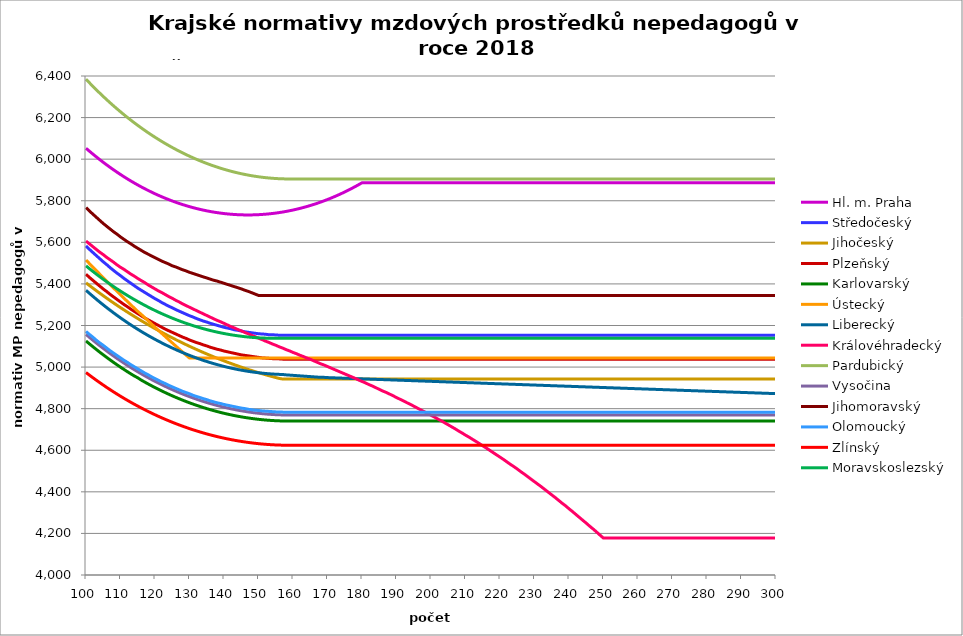
| Category | Hl. m. Praha | Středočeský | Jihočeský | Plzeňský | Karlovarský  | Ústecký   | Liberecký | Královéhradecký | Pardubický | Vysočina | Jihomoravský | Olomoucký | Zlínský | Moravskoslezský |
|---|---|---|---|---|---|---|---|---|---|---|---|---|---|---|
| 100.0 | 6052.468 | 5582.738 | 5404.99 | 5446.608 | 5125.55 | 5514.952 | 5369.339 | 5605.989 | 6384.639 | 5156.925 | 5767.363 | 5171.561 | 4973.825 | 5486.8 |
| 101.0 | 6038.229 | 5566.172 | 5392.238 | 5431.139 | 5111.603 | 5497.761 | 5354.653 | 5592.531 | 6367.266 | 5142.946 | 5750.633 | 5156.948 | 4961.222 | 5473.272 |
| 102.0 | 6024.36 | 5551.073 | 5379.684 | 5417.152 | 5097.969 | 5480.678 | 5340.296 | 5579.138 | 6350.282 | 5129.174 | 5735.508 | 5143.736 | 4948.896 | 5460.059 |
| 103.0 | 6010.859 | 5536.055 | 5367.325 | 5403.237 | 5084.641 | 5463.7 | 5326.264 | 5565.808 | 6333.681 | 5115.739 | 5720.462 | 5129.28 | 4936.843 | 5447.159 |
| 104.0 | 5997.719 | 5521.118 | 5355.159 | 5389.393 | 5071.617 | 5446.828 | 5312.551 | 5552.542 | 6317.458 | 5102.636 | 5705.495 | 5116.208 | 4925.061 | 5434.567 |
| 105.0 | 5984.937 | 5506.262 | 5343.183 | 5375.62 | 5058.893 | 5430.059 | 5299.153 | 5540.803 | 6301.607 | 5089.859 | 5690.605 | 5104.5 | 4913.546 | 5422.278 |
| 106.0 | 5972.509 | 5492.826 | 5331.395 | 5363.284 | 5046.463 | 5413.393 | 5286.066 | 5527.656 | 6286.124 | 5077.405 | 5677.272 | 5091.555 | 4902.293 | 5410.291 |
| 107.0 | 5960.43 | 5478.121 | 5319.793 | 5349.644 | 5034.325 | 5396.829 | 5273.287 | 5516.022 | 6271.004 | 5065.141 | 5664 | 5078.674 | 4891.301 | 5398.6 |
| 108.0 | 5948.697 | 5464.822 | 5308.376 | 5337.427 | 5022.474 | 5380.366 | 5260.81 | 5504.437 | 6256.242 | 5053.192 | 5650.79 | 5067.138 | 4880.566 | 5387.203 |
| 109.0 | 5937.306 | 5451.586 | 5297.14 | 5325.266 | 5010.908 | 5364.003 | 5248.633 | 5491.461 | 6241.834 | 5041.555 | 5639.1 | 5055.653 | 4870.085 | 5376.095 |
| 110.0 | 5926.253 | 5439.729 | 5286.085 | 5313.16 | 4999.621 | 5347.74 | 5236.751 | 5479.979 | 6227.776 | 5030.225 | 5626.006 | 5044.221 | 4859.854 | 5365.274 |
| 111.0 | 5915.535 | 5426.615 | 5275.208 | 5301.109 | 4988.612 | 5331.575 | 5225.161 | 5469.971 | 6214.062 | 5019.199 | 5614.418 | 5032.84 | 4849.872 | 5354.737 |
| 112.0 | 5905.148 | 5414.866 | 5264.507 | 5290.443 | 4977.876 | 5315.507 | 5213.86 | 5458.578 | 6200.689 | 5008.347 | 5602.878 | 5022.767 | 4840.135 | 5344.48 |
| 113.0 | 5895.089 | 5403.169 | 5253.98 | 5278.494 | 4967.411 | 5299.536 | 5202.843 | 5447.233 | 6187.653 | 4997.792 | 5592.819 | 5011.483 | 4830.641 | 5334.501 |
| 114.0 | 5885.354 | 5391.521 | 5243.625 | 5267.919 | 4957.213 | 5283.66 | 5192.108 | 5437.344 | 6174.949 | 4987.532 | 5581.367 | 5001.495 | 4821.386 | 5324.796 |
| 115.0 | 5875.941 | 5379.924 | 5233.442 | 5257.386 | 4948.515 | 5267.879 | 5181.651 | 5426.087 | 6162.575 | 4977.562 | 5571.385 | 4991.546 | 4812.369 | 5315.363 |
| 116.0 | 5866.847 | 5369.656 | 5223.427 | 5246.894 | 4937.607 | 5253.615 | 5171.47 | 5416.275 | 6150.527 | 4967.88 | 5561.438 | 4981.638 | 4803.587 | 5306.199 |
| 117.0 | 5858.07 | 5359.429 | 5213.579 | 5236.445 | 4928.193 | 5238.013 | 5161.561 | 5406.498 | 6138.801 | 4958.359 | 5551.527 | 4971.768 | 4795.037 | 5297.302 |
| 118.0 | 5849.605 | 5349.24 | 5203.897 | 5227.336 | 4919.035 | 5222.503 | 5151.921 | 5395.368 | 6127.393 | 4949.121 | 5543.06 | 4963.164 | 4786.717 | 5288.668 |
| 119.0 | 5841.451 | 5339.089 | 5194.379 | 5218.258 | 4910.13 | 5207.085 | 5142.548 | 5385.667 | 6116.301 | 4940.161 | 5534.619 | 4953.368 | 4778.626 | 5280.296 |
| 120.0 | 5833.605 | 5328.977 | 5185.024 | 5209.212 | 4901.475 | 5191.758 | 5133.439 | 5376 | 6105.52 | 4931.478 | 5526.204 | 4944.828 | 4770.76 | 5272.183 |
| 121.0 | 5826.065 | 5320.161 | 5175.829 | 5200.198 | 4893.069 | 5176.521 | 5124.591 | 5366.368 | 6095.049 | 4923.069 | 5517.814 | 4936.317 | 4763.118 | 5264.327 |
| 122.0 | 5818.829 | 5310.12 | 5166.793 | 5191.214 | 4884.909 | 5161.373 | 5116.002 | 5358.14 | 6084.884 | 4914.81 | 5509.449 | 4927.835 | 4755.698 | 5256.726 |
| 123.0 | 5811.894 | 5301.366 | 5157.915 | 5182.262 | 4876.991 | 5146.313 | 5107.669 | 5348.571 | 6075.022 | 4906.82 | 5502.498 | 4920.588 | 4748.497 | 5249.377 |
| 124.0 | 5805.258 | 5292.64 | 5149.193 | 5174.613 | 4869.315 | 5131.341 | 5099.591 | 5339.037 | 6065.46 | 4899.097 | 5495.565 | 4912.161 | 4741.515 | 5242.279 |
| 125.0 | 5798.919 | 5285.184 | 5140.626 | 5166.986 | 4861.878 | 5116.456 | 5091.763 | 5330.892 | 6056.196 | 4891.639 | 5487.267 | 4904.96 | 4734.748 | 5235.429 |
| 126.0 | 5792.876 | 5276.512 | 5132.212 | 5159.382 | 4854.678 | 5101.657 | 5084.186 | 5321.421 | 6047.228 | 4884.443 | 5481.75 | 4897.78 | 4728.196 | 5228.827 |
| 127.0 | 5787.126 | 5269.101 | 5123.951 | 5151.8 | 4847.713 | 5086.943 | 5076.855 | 5313.33 | 6038.551 | 4877.387 | 5474.868 | 4890.621 | 4721.856 | 5222.469 |
| 128.0 | 5781.668 | 5261.711 | 5115.84 | 5144.241 | 4840.981 | 5072.314 | 5069.77 | 5303.921 | 6030.166 | 4870.59 | 5468.004 | 4883.483 | 4715.727 | 5216.354 |
| 129.0 | 5776.5 | 5254.342 | 5107.878 | 5137.958 | 4834.48 | 5057.769 | 5062.929 | 5295.883 | 6022.068 | 4864.049 | 5462.525 | 4877.551 | 4709.808 | 5210.481 |
| 130.0 | 5771.621 | 5246.993 | 5100.065 | 5130.439 | 4828.208 | 5043.306 | 5056.329 | 5287.869 | 6014.255 | 4857.763 | 5455.692 | 4871.633 | 4704.096 | 5204.848 |
| 131.0 | 5767.029 | 5240.885 | 5092.399 | 5124.19 | 4822.164 | 5043.306 | 5049.968 | 5279.879 | 6006.727 | 4851.729 | 5450.237 | 4864.551 | 4698.591 | 5199.454 |
| 132.0 | 5762.723 | 5233.574 | 5084.878 | 5117.956 | 4816.346 | 5043.306 | 5043.845 | 5271.914 | 5999.479 | 4845.828 | 5444.794 | 4858.664 | 4693.291 | 5194.296 |
| 133.0 | 5758.701 | 5227.497 | 5077.502 | 5112.98 | 4810.753 | 5043.306 | 5037.959 | 5263.972 | 5992.512 | 4840.177 | 5439.361 | 4853.965 | 4688.194 | 5189.374 |
| 134.0 | 5754.963 | 5221.434 | 5070.269 | 5106.773 | 4805.382 | 5043.306 | 5032.307 | 5256.054 | 5985.822 | 4834.773 | 5433.94 | 4848.104 | 4683.3 | 5184.687 |
| 135.0 | 5751.508 | 5216.593 | 5063.179 | 5101.819 | 4800.233 | 5043.306 | 5026.888 | 5248.16 | 5979.407 | 4829.616 | 5428.529 | 4843.426 | 4678.607 | 5180.233 |
| 136.0 | 5748.334 | 5210.556 | 5056.229 | 5095.64 | 4795.304 | 5043.306 | 5021.701 | 5240.29 | 5973.267 | 4824.703 | 5423.129 | 4837.59 | 4674.114 | 5176.01 |
| 137.0 | 5745.44 | 5205.735 | 5049.42 | 5090.707 | 4790.593 | 5043.306 | 5016.744 | 5232.443 | 5967.4 | 4819.917 | 5417.739 | 4832.932 | 4669.82 | 5172.019 |
| 138.0 | 5742.825 | 5200.924 | 5042.749 | 5085.783 | 4786.1 | 5043.306 | 5012.016 | 5224.62 | 5961.803 | 4815.373 | 5413.704 | 4828.283 | 4665.723 | 5168.257 |
| 139.0 | 5740.49 | 5196.122 | 5036.217 | 5082.097 | 4781.823 | 5043.306 | 5007.516 | 5218.118 | 5956.476 | 4811.071 | 5408.333 | 4824.802 | 4661.823 | 5164.724 |
| 140.0 | 5738.433 | 5191.328 | 5029.821 | 5077.19 | 4777.762 | 5043.306 | 5003.242 | 5210.338 | 5951.416 | 4807.007 | 5402.973 | 4820.168 | 4658.119 | 5161.418 |
| 141.0 | 5736.653 | 5187.739 | 5023.561 | 5073.517 | 4773.914 | 5043.306 | 4999.194 | 5202.581 | 5946.624 | 4803.183 | 5397.624 | 4816.699 | 4654.61 | 5158.34 |
| 142.0 | 5735.15 | 5184.155 | 5017.437 | 5069.848 | 4770.28 | 5043.306 | 4995.369 | 5194.846 | 5942.096 | 4799.48 | 5392.285 | 4813.234 | 4651.295 | 5155.488 |
| 143.0 | 5733.924 | 5179.383 | 5011.446 | 5066.185 | 4766.857 | 5043.306 | 4991.768 | 5188.419 | 5937.833 | 4796.013 | 5386.957 | 4809.775 | 4648.173 | 5152.862 |
| 144.0 | 5732.974 | 5177.001 | 5005.589 | 5062.527 | 4763.646 | 5043.306 | 4988.389 | 5180.726 | 5933.833 | 4792.782 | 5381.639 | 4806.32 | 4645.243 | 5150.46 |
| 145.0 | 5732.3 | 5173.431 | 4999.864 | 5058.874 | 4760.645 | 5043.306 | 4985.231 | 5174.334 | 5930.095 | 4789.786 | 5376.331 | 4802.871 | 4642.505 | 5148.282 |
| 146.0 | 5731.902 | 5169.867 | 4994.27 | 5056.442 | 4757.854 | 5043.306 | 4982.294 | 5166.683 | 5926.618 | 4787.024 | 5369.712 | 4800.574 | 4639.958 | 5146.328 |
| 147.0 | 5731.78 | 5167.493 | 4988.807 | 5054.012 | 4755.272 | 5043.306 | 4979.577 | 5160.325 | 5923.402 | 4784.38 | 5364.428 | 4797.133 | 4637.602 | 5144.596 |
| 148.0 | 5731.933 | 5165.122 | 4983.473 | 5051.585 | 4752.897 | 5043.306 | 4977.079 | 5152.716 | 5920.444 | 4781.968 | 5357.838 | 4794.841 | 4635.435 | 5143.088 |
| 149.0 | 5732.362 | 5162.752 | 4978.269 | 5049.16 | 4750.731 | 5043.306 | 4974.799 | 5146.392 | 5917.745 | 4779.788 | 5351.264 | 4792.552 | 4633.457 | 5141.802 |
| 150.0 | 5733.066 | 5160.385 | 4973.193 | 5046.737 | 4748.771 | 5043.306 | 4972.737 | 5138.824 | 5915.304 | 4777.839 | 5344.706 | 4791.408 | 4631.669 | 5140.737 |
| 151.0 | 5734.047 | 5159.202 | 4968.244 | 5044.317 | 4747.018 | 5043.306 | 4970.892 | 5132.534 | 5913.12 | 4776.121 | 5344.706 | 4789.122 | 4630.068 | 5139.894 |
| 152.0 | 5735.304 | 5158.02 | 4963.422 | 5043.107 | 4745.47 | 5043.306 | 4969.264 | 5125.006 | 5911.193 | 4774.518 | 5344.706 | 4787.98 | 4628.656 | 5139.273 |
| 153.0 | 5736.837 | 5155.657 | 4958.726 | 5041.898 | 4744.129 | 5043.306 | 4967.852 | 5118.75 | 5909.521 | 4773.145 | 5344.706 | 4786.838 | 4627.431 | 5138.872 |
| 154.0 | 5738.648 | 5155.657 | 4954.155 | 5040.69 | 4742.992 | 5043.306 | 4966.656 | 5111.263 | 5908.106 | 4772.002 | 5344.706 | 4785.697 | 4626.394 | 5138.693 |
| 155.0 | 5740.736 | 5154.477 | 4949.709 | 5039.483 | 4742.061 | 5043.306 | 4965.676 | 5105.04 | 5906.945 | 4771.088 | 5344.706 | 4784.557 | 4625.544 | 5138.195 |
| 156.0 | 5743.102 | 5153.297 | 4945.387 | 5039.483 | 4741.334 | 5043.306 | 4964.912 | 5097.593 | 5906.04 | 4770.402 | 5344.706 | 4783.417 | 4624.88 | 5138.195 |
| 157.0 | 5745.747 | 5153.297 | 4942.671 | 5038.275 | 4740.812 | 5043.306 | 4964.362 | 5091.404 | 5905.39 | 4769.831 | 5344.706 | 4783.417 | 4624.403 | 5138.195 |
| 158.0 | 5748.672 | 5153.297 | 4942.671 | 5038.275 | 4740.494 | 5043.306 | 4962.571 | 5083.996 | 5904.994 | 4769.489 | 5344.706 | 4782.277 | 4624.113 | 5138.195 |
| 159.0 | 5751.878 | 5153.297 | 4942.671 | 5038.275 | 4740.38 | 5043.306 | 4961.378 | 5077.84 | 5904.852 | 4769.374 | 5344.706 | 4782.277 | 4624.01 | 5138.195 |
| 160.0 | 5755.365 | 5153.297 | 4942.671 | 5038.275 | 4740.471 | 5043.306 | 4960.185 | 5070.472 | 5904.683 | 4769.26 | 5344.706 | 4782.277 | 4624.01 | 5138.195 |
| 161.0 | 5759.134 | 5153.297 | 4942.671 | 5038.275 | 4740.244 | 5043.306 | 4958.993 | 5064.348 | 5904.683 | 4769.26 | 5344.706 | 4782.277 | 4624.01 | 5138.195 |
| 162.0 | 5763.187 | 5153.297 | 4942.671 | 5038.275 | 4740.244 | 5043.306 | 4957.802 | 5057.019 | 5904.683 | 4769.26 | 5344.706 | 4782.277 | 4624.01 | 5138.195 |
| 163.0 | 5767.525 | 5153.297 | 4942.671 | 5038.275 | 4740.244 | 5043.306 | 4956.611 | 5050.927 | 5904.683 | 4769.26 | 5344.706 | 4782.277 | 4624.01 | 5138.195 |
| 164.0 | 5772.149 | 5153.297 | 4942.671 | 5038.275 | 4740.244 | 5043.306 | 4955.421 | 5043.637 | 5904.683 | 4769.26 | 5344.706 | 4782.277 | 4624.01 | 5138.195 |
| 165.0 | 5777.06 | 5153.297 | 4942.671 | 5038.275 | 4740.244 | 5043.306 | 4954.231 | 5037.578 | 5904.683 | 4769.26 | 5344.706 | 4782.277 | 4624.01 | 5138.195 |
| 166.0 | 5782.26 | 5153.297 | 4942.671 | 5038.275 | 4740.244 | 5043.306 | 4953.042 | 5030.326 | 5904.683 | 4769.26 | 5344.706 | 4782.277 | 4624.01 | 5138.195 |
| 167.0 | 5787.75 | 5153.297 | 4942.671 | 5038.275 | 4740.244 | 5043.306 | 4951.853 | 5023.095 | 5904.683 | 4769.26 | 5344.706 | 4782.277 | 4624.01 | 5138.195 |
| 168.0 | 5793.532 | 5153.297 | 4942.671 | 5038.275 | 4740.244 | 5043.306 | 4950.665 | 5015.885 | 5904.683 | 4769.26 | 5344.706 | 4782.277 | 4624.01 | 5138.195 |
| 169.0 | 5799.609 | 5153.297 | 4942.671 | 5038.275 | 4740.244 | 5043.306 | 4950.665 | 5009.892 | 5904.683 | 4769.26 | 5344.706 | 4782.277 | 4624.01 | 5138.195 |
| 170.0 | 5805.98 | 5153.297 | 4942.671 | 5038.275 | 4740.244 | 5043.306 | 4949.477 | 5002.72 | 5904.683 | 4769.26 | 5344.706 | 4782.277 | 4624.01 | 5138.195 |
| 171.0 | 5812.649 | 5153.297 | 4942.671 | 5038.275 | 4740.244 | 5043.306 | 4948.833 | 4995.568 | 5904.683 | 4769.26 | 5344.706 | 4782.277 | 4624.01 | 5138.195 |
| 172.0 | 5819.618 | 5153.297 | 4942.671 | 5038.275 | 4740.244 | 5043.306 | 4948.23 | 4988.437 | 5904.683 | 4769.26 | 5344.706 | 4782.277 | 4624.01 | 5138.195 |
| 173.0 | 5826.888 | 5153.297 | 4942.671 | 5038.275 | 4740.244 | 5043.306 | 4947.628 | 4981.326 | 5904.683 | 4769.26 | 5344.706 | 4782.277 | 4624.01 | 5138.195 |
| 174.0 | 5834.462 | 5153.297 | 4942.671 | 5038.275 | 4740.244 | 5043.306 | 4947.026 | 4974.235 | 5904.683 | 4769.26 | 5344.706 | 4782.277 | 4624.01 | 5138.195 |
| 175.0 | 5842.342 | 5153.297 | 4942.671 | 5038.275 | 4740.244 | 5043.306 | 4946.424 | 4967.164 | 5904.683 | 4769.26 | 5344.706 | 4782.277 | 4624.01 | 5138.195 |
| 176.0 | 5850.53 | 5153.297 | 4942.671 | 5038.275 | 4740.244 | 5043.306 | 4945.822 | 4960.114 | 5904.683 | 4769.26 | 5344.706 | 4782.277 | 4624.01 | 5138.195 |
| 177.0 | 5859.029 | 5153.297 | 4942.671 | 5038.275 | 4740.244 | 5043.306 | 4945.22 | 4953.083 | 5904.683 | 4769.26 | 5344.706 | 4782.277 | 4624.01 | 5138.195 |
| 178.0 | 5867.842 | 5153.297 | 4942.671 | 5038.275 | 4740.244 | 5043.306 | 4944.619 | 4946.072 | 5904.683 | 4769.26 | 5344.706 | 4782.277 | 4624.01 | 5138.195 |
| 179.0 | 5876.971 | 5153.297 | 4942.671 | 5038.275 | 4740.244 | 5043.306 | 4944.017 | 4937.918 | 5904.683 | 4769.26 | 5344.706 | 4782.277 | 4624.01 | 5138.195 |
| 180.0 | 5886.42 | 5153.297 | 4942.671 | 5038.275 | 4740.244 | 5043.306 | 4943.416 | 4930.95 | 5904.683 | 4769.26 | 5344.706 | 4782.277 | 4624.01 | 5138.195 |
| 181.0 | 5886.42 | 5153.297 | 4942.671 | 5038.275 | 4740.244 | 5043.306 | 4942.815 | 4924.002 | 5904.683 | 4769.26 | 5344.706 | 4782.277 | 4624.01 | 5138.195 |
| 182.0 | 5886.42 | 5153.297 | 4942.671 | 5038.275 | 4740.244 | 5043.306 | 4942.214 | 4915.92 | 5904.683 | 4769.26 | 5344.706 | 4782.277 | 4624.01 | 5138.195 |
| 183.0 | 5886.42 | 5153.297 | 4942.671 | 5038.275 | 4740.244 | 5043.306 | 4941.613 | 4909.014 | 5904.683 | 4769.26 | 5344.706 | 4782.277 | 4624.01 | 5138.195 |
| 184.0 | 5886.42 | 5153.297 | 4942.671 | 5038.275 | 4740.244 | 5043.306 | 4941.013 | 4900.982 | 5904.683 | 4769.26 | 5344.706 | 4782.277 | 4624.01 | 5138.195 |
| 185.0 | 5886.42 | 5153.297 | 4942.671 | 5038.275 | 4740.244 | 5043.306 | 4940.412 | 4892.975 | 5904.683 | 4769.26 | 5344.706 | 4782.277 | 4624.01 | 5138.195 |
| 186.0 | 5886.42 | 5153.297 | 4942.671 | 5038.275 | 4740.244 | 5043.306 | 4939.812 | 4884.995 | 5904.683 | 4769.26 | 5344.706 | 4782.277 | 4624.01 | 5138.195 |
| 187.0 | 5886.42 | 5153.297 | 4942.671 | 5038.275 | 4740.244 | 5043.306 | 4939.212 | 4878.176 | 5904.683 | 4769.26 | 5344.706 | 4782.277 | 4624.01 | 5138.195 |
| 188.0 | 5886.42 | 5153.297 | 4942.671 | 5038.275 | 4740.244 | 5043.306 | 4938.612 | 4870.244 | 5904.683 | 4769.26 | 5344.706 | 4782.277 | 4624.01 | 5138.195 |
| 189.0 | 5886.42 | 5153.297 | 4942.671 | 5038.275 | 4740.244 | 5043.306 | 4938.012 | 4862.338 | 5904.683 | 4769.26 | 5344.706 | 4782.277 | 4624.01 | 5138.195 |
| 190.0 | 5886.42 | 5153.297 | 4942.671 | 5038.275 | 4740.244 | 5043.306 | 4937.412 | 4853.333 | 5904.683 | 4769.26 | 5344.706 | 4782.277 | 4624.01 | 5138.195 |
| 191.0 | 5886.42 | 5153.297 | 4942.671 | 5038.275 | 4740.244 | 5043.306 | 4936.812 | 4845.482 | 5904.683 | 4769.26 | 5344.706 | 4782.277 | 4624.01 | 5138.195 |
| 192.0 | 5886.42 | 5153.297 | 4942.671 | 5038.275 | 4740.244 | 5043.306 | 4936.213 | 4837.656 | 5904.683 | 4769.26 | 5344.706 | 4782.277 | 4624.01 | 5138.195 |
| 193.0 | 5886.42 | 5153.297 | 4942.671 | 5038.275 | 4740.244 | 5043.306 | 4935.613 | 4828.743 | 5904.683 | 4769.26 | 5344.706 | 4782.277 | 4624.01 | 5138.195 |
| 194.0 | 5886.42 | 5153.297 | 4942.671 | 5038.275 | 4740.244 | 5043.306 | 4935.014 | 4820.97 | 5904.683 | 4769.26 | 5344.706 | 4782.277 | 4624.01 | 5138.195 |
| 195.0 | 5886.42 | 5153.297 | 4942.671 | 5038.275 | 4740.244 | 5043.306 | 4934.415 | 4812.118 | 5904.683 | 4769.26 | 5344.706 | 4782.277 | 4624.01 | 5138.195 |
| 196.0 | 5886.42 | 5153.297 | 4942.671 | 5038.275 | 4740.244 | 5043.306 | 4933.816 | 4803.299 | 5904.683 | 4769.26 | 5344.706 | 4782.277 | 4624.01 | 5138.195 |
| 197.0 | 5886.42 | 5153.297 | 4942.671 | 5038.275 | 4740.244 | 5043.306 | 4933.217 | 4794.512 | 5904.683 | 4769.26 | 5344.706 | 4782.277 | 4624.01 | 5138.195 |
| 198.0 | 5886.42 | 5153.297 | 4942.671 | 5038.275 | 4740.244 | 5043.306 | 4932.619 | 4785.757 | 5904.683 | 4769.26 | 5344.706 | 4782.277 | 4624.01 | 5138.195 |
| 199.0 | 5886.42 | 5153.297 | 4942.671 | 5038.275 | 4740.244 | 5043.306 | 4932.02 | 4777.033 | 5904.683 | 4769.26 | 5344.706 | 4782.277 | 4624.01 | 5138.195 |
| 200.0 | 5886.42 | 5153.297 | 4942.671 | 5038.275 | 4740.244 | 5043.306 | 4931.422 | 4768.342 | 5904.683 | 4769.26 | 5344.706 | 4782.277 | 4624.01 | 5138.195 |
| 201.0 | 5886.42 | 5153.297 | 4942.671 | 5038.275 | 4740.244 | 5043.306 | 4930.824 | 4759.682 | 5904.683 | 4769.26 | 5344.706 | 4782.277 | 4624.01 | 5138.195 |
| 202.0 | 5886.42 | 5153.297 | 4942.671 | 5038.275 | 4740.244 | 5043.306 | 4930.226 | 4749.977 | 5904.683 | 4769.26 | 5344.706 | 4782.277 | 4624.01 | 5138.195 |
| 203.0 | 5886.42 | 5153.297 | 4942.671 | 5038.275 | 4740.244 | 5043.306 | 4929.628 | 4741.384 | 5904.683 | 4769.26 | 5344.706 | 4782.277 | 4624.01 | 5138.195 |
| 204.0 | 5886.42 | 5153.297 | 4942.671 | 5038.275 | 4740.244 | 5043.306 | 4929.03 | 4731.754 | 5904.683 | 4769.26 | 5344.706 | 4782.277 | 4624.01 | 5138.195 |
| 205.0 | 5886.42 | 5153.297 | 4942.671 | 5038.275 | 4740.244 | 5043.306 | 4928.433 | 4722.162 | 5904.683 | 4769.26 | 5344.706 | 4782.277 | 4624.01 | 5138.195 |
| 206.0 | 5886.42 | 5153.297 | 4942.671 | 5038.275 | 4740.244 | 5043.306 | 4927.835 | 4712.61 | 5904.683 | 4769.26 | 5344.706 | 4782.277 | 4624.01 | 5138.195 |
| 207.0 | 5886.42 | 5153.297 | 4942.671 | 5038.275 | 4740.244 | 5043.306 | 4927.238 | 4703.096 | 5904.683 | 4769.26 | 5344.706 | 4782.277 | 4624.01 | 5138.195 |
| 208.0 | 5886.42 | 5153.297 | 4942.671 | 5038.275 | 4740.244 | 5043.306 | 4926.641 | 4692.569 | 5904.683 | 4769.26 | 5344.706 | 4782.277 | 4624.01 | 5138.195 |
| 209.0 | 5886.42 | 5153.297 | 4942.671 | 5038.275 | 4740.244 | 5043.306 | 4926.044 | 4683.136 | 5904.683 | 4769.26 | 5344.706 | 4782.277 | 4624.01 | 5138.195 |
| 210.0 | 5886.42 | 5153.297 | 4942.671 | 5038.275 | 4740.244 | 5043.306 | 4925.447 | 4672.699 | 5904.683 | 4769.26 | 5344.706 | 4782.277 | 4624.01 | 5138.195 |
| 211.0 | 5886.42 | 5153.297 | 4942.671 | 5038.275 | 4740.244 | 5043.306 | 4924.85 | 4663.345 | 5904.683 | 4769.26 | 5344.706 | 4782.277 | 4624.01 | 5138.195 |
| 212.0 | 5886.42 | 5153.297 | 4942.671 | 5038.275 | 4740.244 | 5043.306 | 4924.253 | 4652.996 | 5904.683 | 4769.26 | 5344.706 | 4782.277 | 4624.01 | 5138.195 |
| 213.0 | 5886.42 | 5153.297 | 4942.671 | 5038.275 | 4740.244 | 5043.306 | 4923.657 | 4642.693 | 5904.683 | 4769.26 | 5344.706 | 4782.277 | 4624.01 | 5138.195 |
| 214.0 | 5886.42 | 5153.297 | 4942.671 | 5038.275 | 4740.244 | 5043.306 | 4923.061 | 4632.435 | 5904.683 | 4769.26 | 5344.706 | 4782.277 | 4624.01 | 5138.195 |
| 215.0 | 5886.42 | 5153.297 | 4942.671 | 5038.275 | 4740.244 | 5043.306 | 4922.464 | 4621.203 | 5904.683 | 4769.26 | 5344.706 | 4782.277 | 4624.01 | 5138.195 |
| 216.0 | 5886.42 | 5153.297 | 4942.671 | 5038.275 | 4740.244 | 5043.306 | 4921.868 | 4611.04 | 5904.683 | 4769.26 | 5344.706 | 4782.277 | 4624.01 | 5138.195 |
| 217.0 | 5886.42 | 5153.297 | 4942.671 | 5038.275 | 4740.244 | 5043.306 | 4921.273 | 4599.912 | 5904.683 | 4769.26 | 5344.706 | 4782.277 | 4624.01 | 5138.195 |
| 218.0 | 5886.42 | 5153.297 | 4942.671 | 5038.275 | 4740.244 | 5043.306 | 4920.677 | 4588.838 | 5904.683 | 4769.26 | 5344.706 | 4782.277 | 4624.01 | 5138.195 |
| 219.0 | 5886.42 | 5153.297 | 4942.671 | 5038.275 | 4740.244 | 5043.306 | 4920.081 | 4577.817 | 5904.683 | 4769.26 | 5344.706 | 4782.277 | 4624.01 | 5138.195 |
| 220.0 | 5886.42 | 5153.297 | 4942.671 | 5038.275 | 4740.244 | 5043.306 | 4919.486 | 4566.848 | 5904.683 | 4769.26 | 5344.706 | 4782.277 | 4624.01 | 5138.195 |
| 221.0 | 5886.42 | 5153.297 | 4942.671 | 5038.275 | 4740.244 | 5043.306 | 4918.891 | 4555.932 | 5904.683 | 4769.26 | 5344.706 | 4782.277 | 4624.01 | 5138.195 |
| 222.0 | 5886.42 | 5153.297 | 4942.671 | 5038.275 | 4740.244 | 5043.306 | 4918.295 | 4544.083 | 5904.683 | 4769.26 | 5344.706 | 4782.277 | 4624.01 | 5138.195 |
| 223.0 | 5886.42 | 5153.297 | 4942.671 | 5038.275 | 4740.244 | 5043.306 | 4917.7 | 4532.296 | 5904.683 | 4769.26 | 5344.706 | 4782.277 | 4624.01 | 5138.195 |
| 224.0 | 5886.42 | 5153.297 | 4942.671 | 5038.275 | 4740.244 | 5043.306 | 4917.106 | 4521.544 | 5904.683 | 4769.26 | 5344.706 | 4782.277 | 4624.01 | 5138.195 |
| 225.0 | 5886.42 | 5153.297 | 4942.671 | 5038.275 | 4740.244 | 5043.306 | 4916.511 | 4509.873 | 5904.683 | 4769.26 | 5344.706 | 4782.277 | 4624.01 | 5138.195 |
| 226.0 | 5886.42 | 5153.297 | 4942.671 | 5038.275 | 4740.244 | 5043.306 | 4915.916 | 4497.297 | 5904.683 | 4769.26 | 5344.706 | 4782.277 | 4624.01 | 5138.195 |
| 227.0 | 5886.42 | 5153.297 | 4942.671 | 5038.275 | 4740.244 | 5043.306 | 4915.322 | 4485.751 | 5904.683 | 4769.26 | 5344.706 | 4782.277 | 4624.01 | 5138.195 |
| 228.0 | 5886.42 | 5153.297 | 4942.671 | 5038.275 | 4740.244 | 5043.306 | 4914.728 | 4473.309 | 5904.683 | 4769.26 | 5344.706 | 4782.277 | 4624.01 | 5138.195 |
| 229.0 | 5886.42 | 5153.297 | 4942.671 | 5038.275 | 4740.244 | 5043.306 | 4914.133 | 4460.936 | 5904.683 | 4769.26 | 5344.706 | 4782.277 | 4624.01 | 5138.195 |
| 230.0 | 5886.42 | 5153.297 | 4942.671 | 5038.275 | 4740.244 | 5043.306 | 4913.539 | 4448.631 | 5904.683 | 4769.26 | 5344.706 | 4782.277 | 4624.01 | 5138.195 |
| 231.0 | 5886.42 | 5153.297 | 4942.671 | 5038.275 | 4740.244 | 5043.306 | 4912.946 | 4436.394 | 5904.683 | 4769.26 | 5344.706 | 4782.277 | 4624.01 | 5138.195 |
| 232.0 | 5886.42 | 5153.297 | 4942.671 | 5038.275 | 4740.244 | 5043.306 | 4912.352 | 4424.225 | 5904.683 | 4769.26 | 5344.706 | 4782.277 | 4624.01 | 5138.195 |
| 233.0 | 5886.42 | 5153.297 | 4942.671 | 5038.275 | 4740.244 | 5043.306 | 4911.758 | 4411.193 | 5904.683 | 4769.26 | 5344.706 | 4782.277 | 4624.01 | 5138.195 |
| 234.0 | 5886.42 | 5153.297 | 4942.671 | 5038.275 | 4740.244 | 5043.306 | 4911.165 | 4398.238 | 5904.683 | 4769.26 | 5344.706 | 4782.277 | 4624.01 | 5138.195 |
| 235.0 | 5886.42 | 5153.297 | 4942.671 | 5038.275 | 4740.244 | 5043.306 | 4910.572 | 4385.359 | 5904.683 | 4769.26 | 5344.706 | 4782.277 | 4624.01 | 5138.195 |
| 236.0 | 5886.42 | 5153.297 | 4942.671 | 5038.275 | 4740.244 | 5043.306 | 4909.978 | 4372.555 | 5904.683 | 4769.26 | 5344.706 | 4782.277 | 4624.01 | 5138.195 |
| 237.0 | 5886.42 | 5153.297 | 4942.671 | 5038.275 | 4740.244 | 5043.306 | 4909.385 | 4358.919 | 5904.683 | 4769.26 | 5344.706 | 4782.277 | 4624.01 | 5138.195 |
| 238.0 | 5886.42 | 5153.297 | 4942.671 | 5038.275 | 4740.244 | 5043.306 | 4908.793 | 4345.368 | 5904.683 | 4769.26 | 5344.706 | 4782.277 | 4624.01 | 5138.195 |
| 239.0 | 5886.42 | 5153.297 | 4942.671 | 5038.275 | 4740.244 | 5043.306 | 4908.2 | 4332.796 | 5904.683 | 4769.26 | 5344.706 | 4782.277 | 4624.01 | 5138.195 |
| 240.0 | 5886.42 | 5153.297 | 4942.671 | 5038.275 | 4740.244 | 5043.306 | 4907.607 | 4318.517 | 5904.683 | 4769.26 | 5344.706 | 4782.277 | 4624.01 | 5138.195 |
| 241.0 | 5886.42 | 5153.297 | 4942.671 | 5038.275 | 4740.244 | 5043.306 | 4907.015 | 4305.216 | 5904.683 | 4769.26 | 5344.706 | 4782.277 | 4624.01 | 5138.195 |
| 242.0 | 5886.42 | 5153.297 | 4942.671 | 5038.275 | 4740.244 | 5043.306 | 4906.423 | 4291.117 | 5904.683 | 4769.26 | 5344.706 | 4782.277 | 4624.01 | 5138.195 |
| 243.0 | 5886.42 | 5153.297 | 4942.671 | 5038.275 | 4740.244 | 5043.306 | 4905.831 | 4277.111 | 5904.683 | 4769.26 | 5344.706 | 4782.277 | 4624.01 | 5138.195 |
| 244.0 | 5886.42 | 5153.297 | 4942.671 | 5038.275 | 4740.244 | 5043.306 | 4905.239 | 4263.196 | 5904.683 | 4769.26 | 5344.706 | 4782.277 | 4624.01 | 5138.195 |
| 245.0 | 5886.42 | 5153.297 | 4942.671 | 5038.275 | 4740.244 | 5043.306 | 4904.647 | 4249.372 | 5904.683 | 4769.26 | 5344.706 | 4782.277 | 4624.01 | 5138.195 |
| 246.0 | 5886.42 | 5153.297 | 4942.671 | 5038.275 | 4740.244 | 5043.306 | 4904.055 | 4234.781 | 5904.683 | 4769.26 | 5344.706 | 4782.277 | 4624.01 | 5138.195 |
| 247.0 | 5886.42 | 5153.297 | 4942.671 | 5038.275 | 4740.244 | 5043.306 | 4903.463 | 4221.14 | 5904.683 | 4769.26 | 5344.706 | 4782.277 | 4624.01 | 5138.195 |
| 248.0 | 5886.42 | 5153.297 | 4942.671 | 5038.275 | 4740.244 | 5043.306 | 4902.872 | 4206.742 | 5904.683 | 4769.26 | 5344.706 | 4782.277 | 4624.01 | 5138.195 |
| 249.0 | 5886.42 | 5153.297 | 4942.671 | 5038.275 | 4740.244 | 5043.306 | 4902.281 | 4191.603 | 5904.683 | 4769.26 | 5344.706 | 4782.277 | 4624.01 | 5138.195 |
| 250.0 | 5886.42 | 5153.297 | 4942.671 | 5038.275 | 4740.244 | 5043.306 | 4901.69 | 4177.406 | 5904.683 | 4769.26 | 5344.706 | 4782.277 | 4624.01 | 5138.195 |
| 251.0 | 5886.42 | 5153.297 | 4942.671 | 5038.275 | 4740.244 | 5043.306 | 4901.099 | 4177.406 | 5904.683 | 4769.26 | 5344.706 | 4782.277 | 4624.01 | 5138.195 |
| 252.0 | 5886.42 | 5153.297 | 4942.671 | 5038.275 | 4740.244 | 5043.306 | 4900.508 | 4177.406 | 5904.683 | 4769.26 | 5344.706 | 4782.277 | 4624.01 | 5138.195 |
| 253.0 | 5886.42 | 5153.297 | 4942.671 | 5038.275 | 4740.244 | 5043.306 | 4899.917 | 4177.406 | 5904.683 | 4769.26 | 5344.706 | 4782.277 | 4624.01 | 5138.195 |
| 254.0 | 5886.42 | 5153.297 | 4942.671 | 5038.275 | 4740.244 | 5043.306 | 4899.326 | 4177.406 | 5904.683 | 4769.26 | 5344.706 | 4782.277 | 4624.01 | 5138.195 |
| 255.0 | 5886.42 | 5153.297 | 4942.671 | 5038.275 | 4740.244 | 5043.306 | 4898.736 | 4177.406 | 5904.683 | 4769.26 | 5344.706 | 4782.277 | 4624.01 | 5138.195 |
| 256.0 | 5886.42 | 5153.297 | 4942.671 | 5038.275 | 4740.244 | 5043.306 | 4898.146 | 4177.406 | 5904.683 | 4769.26 | 5344.706 | 4782.277 | 4624.01 | 5138.195 |
| 257.0 | 5886.42 | 5153.297 | 4942.671 | 5038.275 | 4740.244 | 5043.306 | 4897.556 | 4177.406 | 5904.683 | 4769.26 | 5344.706 | 4782.277 | 4624.01 | 5138.195 |
| 258.0 | 5886.42 | 5153.297 | 4942.671 | 5038.275 | 4740.244 | 5043.306 | 4896.966 | 4177.406 | 5904.683 | 4769.26 | 5344.706 | 4782.277 | 4624.01 | 5138.195 |
| 259.0 | 5886.42 | 5153.297 | 4942.671 | 5038.275 | 4740.244 | 5043.306 | 4896.376 | 4177.406 | 5904.683 | 4769.26 | 5344.706 | 4782.277 | 4624.01 | 5138.195 |
| 260.0 | 5886.42 | 5153.297 | 4942.671 | 5038.275 | 4740.244 | 5043.306 | 4895.786 | 4177.406 | 5904.683 | 4769.26 | 5344.706 | 4782.277 | 4624.01 | 5138.195 |
| 261.0 | 5886.42 | 5153.297 | 4942.671 | 5038.275 | 4740.244 | 5043.306 | 4895.196 | 4177.406 | 5904.683 | 4769.26 | 5344.706 | 4782.277 | 4624.01 | 5138.195 |
| 262.0 | 5886.42 | 5153.297 | 4942.671 | 5038.275 | 4740.244 | 5043.306 | 4894.607 | 4177.406 | 5904.683 | 4769.26 | 5344.706 | 4782.277 | 4624.01 | 5138.195 |
| 263.0 | 5886.42 | 5153.297 | 4942.671 | 5038.275 | 4740.244 | 5043.306 | 4894.018 | 4177.406 | 5904.683 | 4769.26 | 5344.706 | 4782.277 | 4624.01 | 5138.195 |
| 264.0 | 5886.42 | 5153.297 | 4942.671 | 5038.275 | 4740.244 | 5043.306 | 4893.429 | 4177.406 | 5904.683 | 4769.26 | 5344.706 | 4782.277 | 4624.01 | 5138.195 |
| 265.0 | 5886.42 | 5153.297 | 4942.671 | 5038.275 | 4740.244 | 5043.306 | 4892.84 | 4177.406 | 5904.683 | 4769.26 | 5344.706 | 4782.277 | 4624.01 | 5138.195 |
| 266.0 | 5886.42 | 5153.297 | 4942.671 | 5038.275 | 4740.244 | 5043.306 | 4892.251 | 4177.406 | 5904.683 | 4769.26 | 5344.706 | 4782.277 | 4624.01 | 5138.195 |
| 267.0 | 5886.42 | 5153.297 | 4942.671 | 5038.275 | 4740.244 | 5043.306 | 4891.662 | 4177.406 | 5904.683 | 4769.26 | 5344.706 | 4782.277 | 4624.01 | 5138.195 |
| 268.0 | 5886.42 | 5153.297 | 4942.671 | 5038.275 | 4740.244 | 5043.306 | 4891.073 | 4177.406 | 5904.683 | 4769.26 | 5344.706 | 4782.277 | 4624.01 | 5138.195 |
| 269.0 | 5886.42 | 5153.297 | 4942.671 | 5038.275 | 4740.244 | 5043.306 | 4890.485 | 4177.406 | 5904.683 | 4769.26 | 5344.706 | 4782.277 | 4624.01 | 5138.195 |
| 270.0 | 5886.42 | 5153.297 | 4942.671 | 5038.275 | 4740.244 | 5043.306 | 4889.897 | 4177.406 | 5904.683 | 4769.26 | 5344.706 | 4782.277 | 4624.01 | 5138.195 |
| 271.0 | 5886.42 | 5153.297 | 4942.671 | 5038.275 | 4740.244 | 5043.306 | 4889.309 | 4177.406 | 5904.683 | 4769.26 | 5344.706 | 4782.277 | 4624.01 | 5138.195 |
| 272.0 | 5886.42 | 5153.297 | 4942.671 | 5038.275 | 4740.244 | 5043.306 | 4888.721 | 4177.406 | 5904.683 | 4769.26 | 5344.706 | 4782.277 | 4624.01 | 5138.195 |
| 273.0 | 5886.42 | 5153.297 | 4942.671 | 5038.275 | 4740.244 | 5043.306 | 4888.133 | 4177.406 | 5904.683 | 4769.26 | 5344.706 | 4782.277 | 4624.01 | 5138.195 |
| 274.0 | 5886.42 | 5153.297 | 4942.671 | 5038.275 | 4740.244 | 5043.306 | 4887.545 | 4177.406 | 5904.683 | 4769.26 | 5344.706 | 4782.277 | 4624.01 | 5138.195 |
| 275.0 | 5886.42 | 5153.297 | 4942.671 | 5038.275 | 4740.244 | 5043.306 | 4886.957 | 4177.406 | 5904.683 | 4769.26 | 5344.706 | 4782.277 | 4624.01 | 5138.195 |
| 276.0 | 5886.42 | 5153.297 | 4942.671 | 5038.275 | 4740.244 | 5043.306 | 4886.37 | 4177.406 | 5904.683 | 4769.26 | 5344.706 | 4782.277 | 4624.01 | 5138.195 |
| 277.0 | 5886.42 | 5153.297 | 4942.671 | 5038.275 | 4740.244 | 5043.306 | 4885.783 | 4177.406 | 5904.683 | 4769.26 | 5344.706 | 4782.277 | 4624.01 | 5138.195 |
| 278.0 | 5886.42 | 5153.297 | 4942.671 | 5038.275 | 4740.244 | 5043.306 | 4885.195 | 4177.406 | 5904.683 | 4769.26 | 5344.706 | 4782.277 | 4624.01 | 5138.195 |
| 279.0 | 5886.42 | 5153.297 | 4942.671 | 5038.275 | 4740.244 | 5043.306 | 4884.608 | 4177.406 | 5904.683 | 4769.26 | 5344.706 | 4782.277 | 4624.01 | 5138.195 |
| 280.0 | 5886.42 | 5153.297 | 4942.671 | 5038.275 | 4740.244 | 5043.306 | 4884.022 | 4177.406 | 5904.683 | 4769.26 | 5344.706 | 4782.277 | 4624.01 | 5138.195 |
| 281.0 | 5886.42 | 5153.297 | 4942.671 | 5038.275 | 4740.244 | 5043.306 | 4883.435 | 4177.406 | 5904.683 | 4769.26 | 5344.706 | 4782.277 | 4624.01 | 5138.195 |
| 282.0 | 5886.42 | 5153.297 | 4942.671 | 5038.275 | 4740.244 | 5043.306 | 4882.848 | 4177.406 | 5904.683 | 4769.26 | 5344.706 | 4782.277 | 4624.01 | 5138.195 |
| 283.0 | 5886.42 | 5153.297 | 4942.671 | 5038.275 | 4740.244 | 5043.306 | 4882.262 | 4177.406 | 5904.683 | 4769.26 | 5344.706 | 4782.277 | 4624.01 | 5138.195 |
| 284.0 | 5886.42 | 5153.297 | 4942.671 | 5038.275 | 4740.244 | 5043.306 | 4881.675 | 4177.406 | 5904.683 | 4769.26 | 5344.706 | 4782.277 | 4624.01 | 5138.195 |
| 285.0 | 5886.42 | 5153.297 | 4942.671 | 5038.275 | 4740.244 | 5043.306 | 4881.089 | 4177.406 | 5904.683 | 4769.26 | 5344.706 | 4782.277 | 4624.01 | 5138.195 |
| 286.0 | 5886.42 | 5153.297 | 4942.671 | 5038.275 | 4740.244 | 5043.306 | 4880.503 | 4177.406 | 5904.683 | 4769.26 | 5344.706 | 4782.277 | 4624.01 | 5138.195 |
| 287.0 | 5886.42 | 5153.297 | 4942.671 | 5038.275 | 4740.244 | 5043.306 | 4879.917 | 4177.406 | 5904.683 | 4769.26 | 5344.706 | 4782.277 | 4624.01 | 5138.195 |
| 288.0 | 5886.42 | 5153.297 | 4942.671 | 5038.275 | 4740.244 | 5043.306 | 4879.332 | 4177.406 | 5904.683 | 4769.26 | 5344.706 | 4782.277 | 4624.01 | 5138.195 |
| 289.0 | 5886.42 | 5153.297 | 4942.671 | 5038.275 | 4740.244 | 5043.306 | 4878.746 | 4177.406 | 5904.683 | 4769.26 | 5344.706 | 4782.277 | 4624.01 | 5138.195 |
| 290.0 | 5886.42 | 5153.297 | 4942.671 | 5038.275 | 4740.244 | 5043.306 | 4878.161 | 4177.406 | 5904.683 | 4769.26 | 5344.706 | 4782.277 | 4624.01 | 5138.195 |
| 291.0 | 5886.42 | 5153.297 | 4942.671 | 5038.275 | 4740.244 | 5043.306 | 4877.575 | 4177.406 | 5904.683 | 4769.26 | 5344.706 | 4782.277 | 4624.01 | 5138.195 |
| 292.0 | 5886.42 | 5153.297 | 4942.671 | 5038.275 | 4740.244 | 5043.306 | 4876.99 | 4177.406 | 5904.683 | 4769.26 | 5344.706 | 4782.277 | 4624.01 | 5138.195 |
| 293.0 | 5886.42 | 5153.297 | 4942.671 | 5038.275 | 4740.244 | 5043.306 | 4876.405 | 4177.406 | 5904.683 | 4769.26 | 5344.706 | 4782.277 | 4624.01 | 5138.195 |
| 294.0 | 5886.42 | 5153.297 | 4942.671 | 5038.275 | 4740.244 | 5043.306 | 4875.82 | 4177.406 | 5904.683 | 4769.26 | 5344.706 | 4782.277 | 4624.01 | 5138.195 |
| 295.0 | 5886.42 | 5153.297 | 4942.671 | 5038.275 | 4740.244 | 5043.306 | 4875.235 | 4177.406 | 5904.683 | 4769.26 | 5344.706 | 4782.277 | 4624.01 | 5138.195 |
| 296.0 | 5886.42 | 5153.297 | 4942.671 | 5038.275 | 4740.244 | 5043.306 | 4874.651 | 4177.406 | 5904.683 | 4769.26 | 5344.706 | 4782.277 | 4624.01 | 5138.195 |
| 297.0 | 5886.42 | 5153.297 | 4942.671 | 5038.275 | 4740.244 | 5043.306 | 4874.066 | 4177.406 | 5904.683 | 4769.26 | 5344.706 | 4782.277 | 4624.01 | 5138.195 |
| 298.0 | 5886.42 | 5153.297 | 4942.671 | 5038.275 | 4740.244 | 5043.306 | 4873.482 | 4177.406 | 5904.683 | 4769.26 | 5344.706 | 4782.277 | 4624.01 | 5138.195 |
| 299.0 | 5886.42 | 5153.297 | 4942.671 | 5038.275 | 4740.244 | 5043.306 | 4872.898 | 4177.406 | 5904.683 | 4769.26 | 5344.706 | 4782.277 | 4624.01 | 5138.195 |
| 300.0 | 5886.42 | 5153.297 | 4942.671 | 5038.275 | 4740.244 | 5043.306 | 4872.314 | 4177.406 | 5904.683 | 4769.26 | 5344.706 | 4782.277 | 4624.01 | 5138.195 |